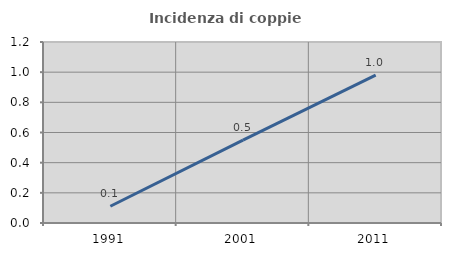
| Category | Incidenza di coppie miste |
|---|---|
| 1991.0 | 0.111 |
| 2001.0 | 0.549 |
| 2011.0 | 0.981 |